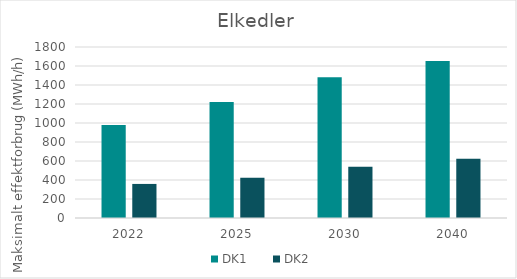
| Category | DK1 | DK2 |
|---|---|---|
| 2022.0 | 980.21 | 358.6 |
| 2025.0 | 1220.21 | 423.6 |
| 2030.0 | 1482.249 | 538.6 |
| 2040.0 | 1652.249 | 623.6 |